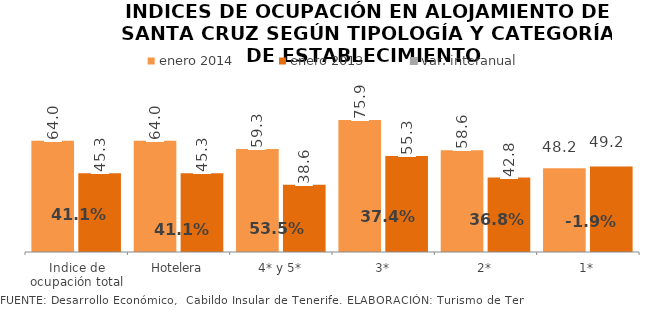
| Category | enero 2014 | enero 2013 |
|---|---|---|
| Indice de ocupación total | 63.96 | 45.343 |
| Hotelera | 63.96 | 45.343 |
| 4* y 5* | 59.299 | 38.633 |
| 3* | 75.94 | 55.253 |
| 2* | 58.56 | 42.82 |
| 1* | 48.23 | 49.184 |